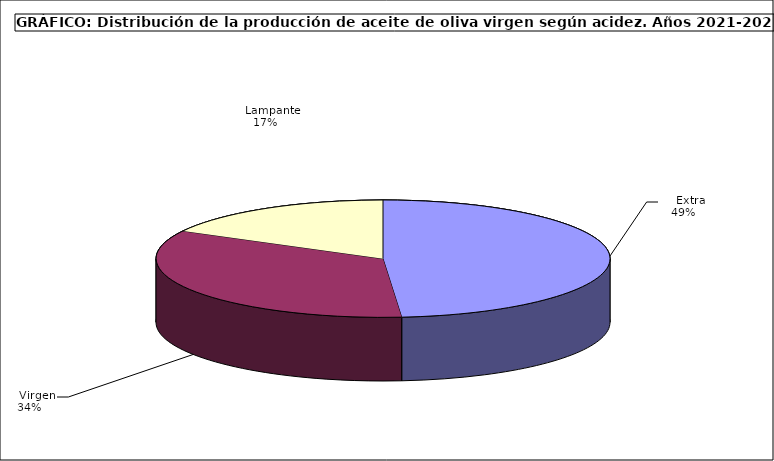
| Category | Series 0 |
|---|---|
|     Extra  | 726494 |
|     Virgen  | 509532 |
|     Lampante  | 256043 |